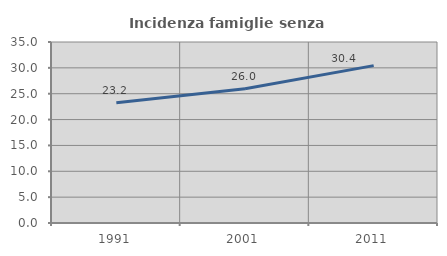
| Category | Incidenza famiglie senza nuclei |
|---|---|
| 1991.0 | 23.248 |
| 2001.0 | 25.957 |
| 2011.0 | 30.431 |